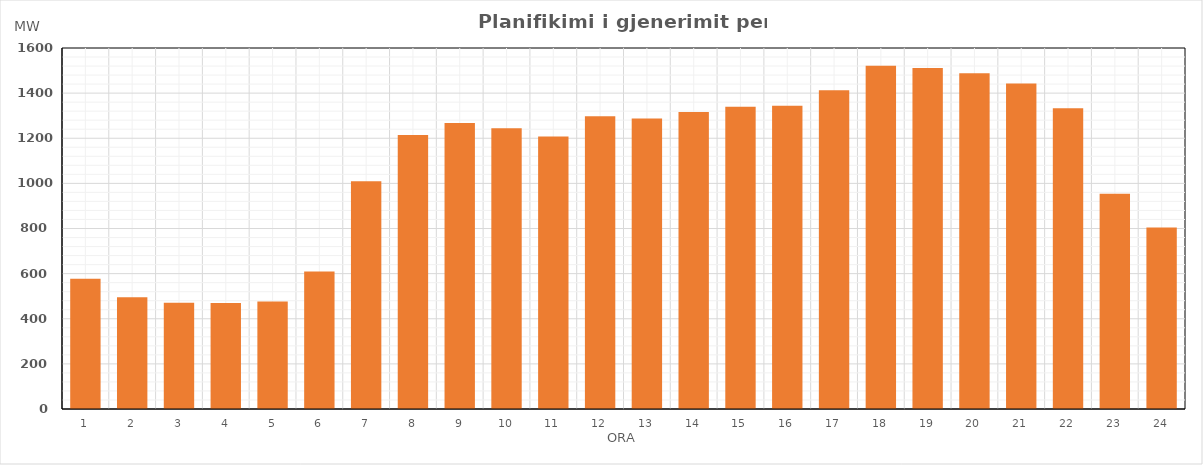
| Category | Max (MW) |
|---|---|
| 0 | 576.99 |
| 1 | 495.34 |
| 2 | 471.36 |
| 3 | 469.9 |
| 4 | 476.9 |
| 5 | 609.48 |
| 6 | 1009.38 |
| 7 | 1214.86 |
| 8 | 1267.25 |
| 9 | 1244.18 |
| 10 | 1207.44 |
| 11 | 1297.21 |
| 12 | 1287.76 |
| 13 | 1315.84 |
| 14 | 1339.48 |
| 15 | 1343.77 |
| 16 | 1412.69 |
| 17 | 1521.03 |
| 18 | 1511.58 |
| 19 | 1487.85 |
| 20 | 1442.65 |
| 21 | 1333.09 |
| 22 | 954.1 |
| 23 | 804.53 |